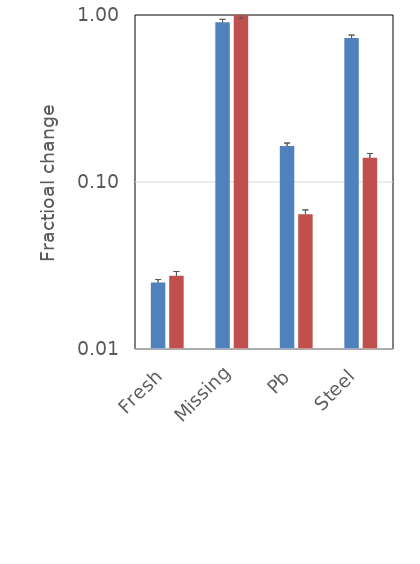
| Category | Series 0 | Series 1 |
|---|---|---|
| Fresh | 0.025 | 0.027 |
| Missing | 0.904 | 1.013 |
| Pb | 0.164 | 0.064 |
| Steel | 0.727 | 0.14 |